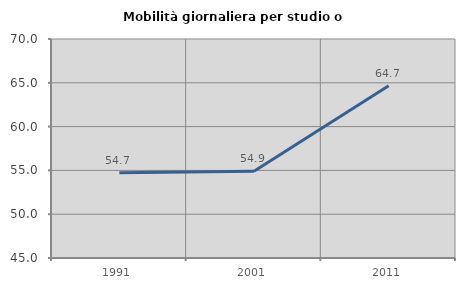
| Category | Mobilità giornaliera per studio o lavoro |
|---|---|
| 1991.0 | 54.73 |
| 2001.0 | 54.902 |
| 2011.0 | 64.667 |